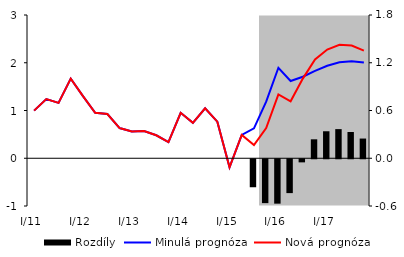
| Category | Rozdíly |
|---|---|
| 0 | 0 |
| 1 | 0 |
| 2 | 0 |
| 3 | 0 |
| 4 | 0 |
| 5 | 0 |
| 6 | 0 |
| 7 | 0 |
| 8 | 0 |
| 9 | 0 |
| 10 | 0 |
| 11 | 0 |
| 12 | 0 |
| 13 | 0 |
| 14 | 0 |
| 15 | 0 |
| 16 | 0 |
| 17 | 0 |
| 18 | -0.352 |
| 19 | -0.551 |
| 20 | -0.558 |
| 21 | -0.425 |
| 22 | -0.039 |
| 23 | 0.238 |
| 24 | 0.339 |
| 25 | 0.366 |
| 26 | 0.33 |
| 27 | 0.248 |